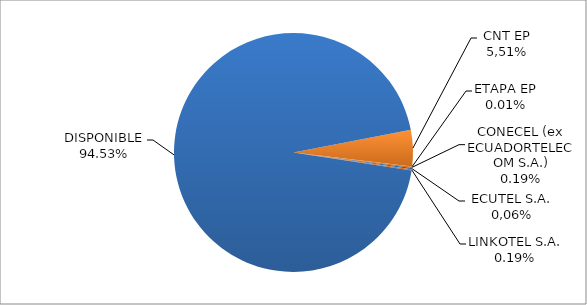
| Category | CODIGO DE AREA 5 |
|---|---|
| CORPORACIÓN NACIONAL TELECOMUNICACIONES CNT EP | 0.049 |
| ETAPA EP | 0 |
| CONECEL (ex ECUADORTELECOM S.A.) | 0.002 |
| SETEL S.A. | 0.002 |
| LINKOTEL S.A. | 0.002 |
| DISPONIBLE | 0.945 |